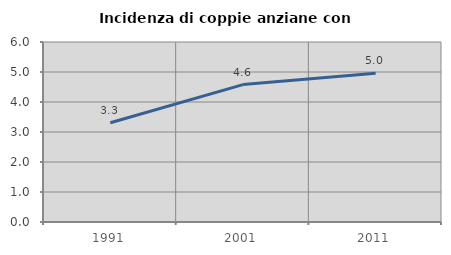
| Category | Incidenza di coppie anziane con figli |
|---|---|
| 1991.0 | 3.309 |
| 2001.0 | 4.58 |
| 2011.0 | 4.962 |